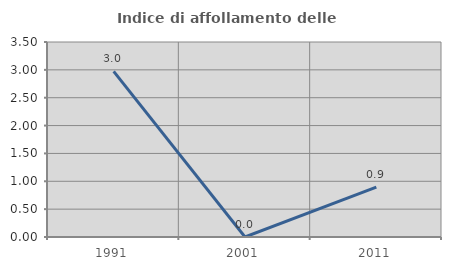
| Category | Indice di affollamento delle abitazioni  |
|---|---|
| 1991.0 | 2.972 |
| 2001.0 | 0 |
| 2011.0 | 0.896 |